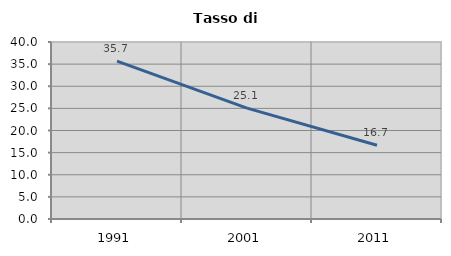
| Category | Tasso di disoccupazione   |
|---|---|
| 1991.0 | 35.687 |
| 2001.0 | 25.059 |
| 2011.0 | 16.674 |